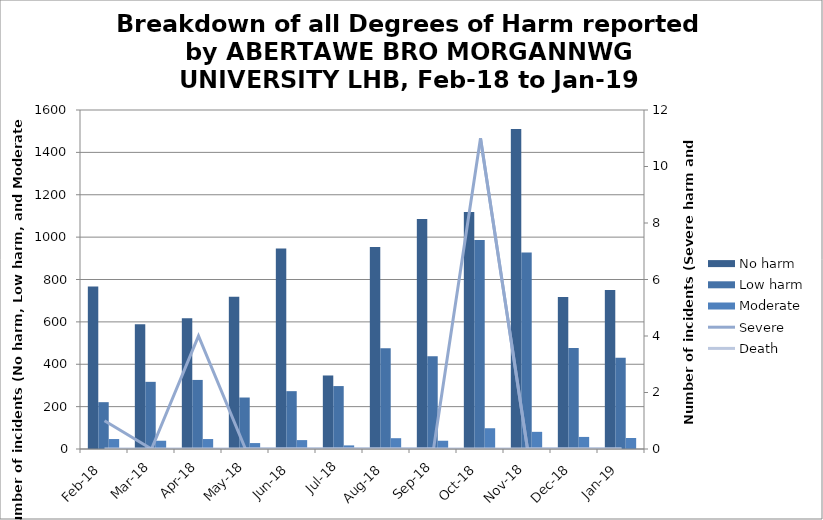
| Category | No harm | Low harm | Moderate |
|---|---|---|---|
| Feb-18 | 767 | 221 | 47 |
| Mar-18 | 589 | 317 | 39 |
| Apr-18 | 617 | 326 | 47 |
| May-18 | 718 | 243 | 28 |
| Jun-18 | 946 | 273 | 42 |
| Jul-18 | 347 | 297 | 17 |
| Aug-18 | 953 | 475 | 51 |
| Sep-18 | 1085 | 438 | 39 |
| Oct-18 | 1119 | 986 | 98 |
| Nov-18 | 1510 | 928 | 81 |
| Dec-18 | 717 | 477 | 57 |
| Jan-19 | 751 | 431 | 52 |